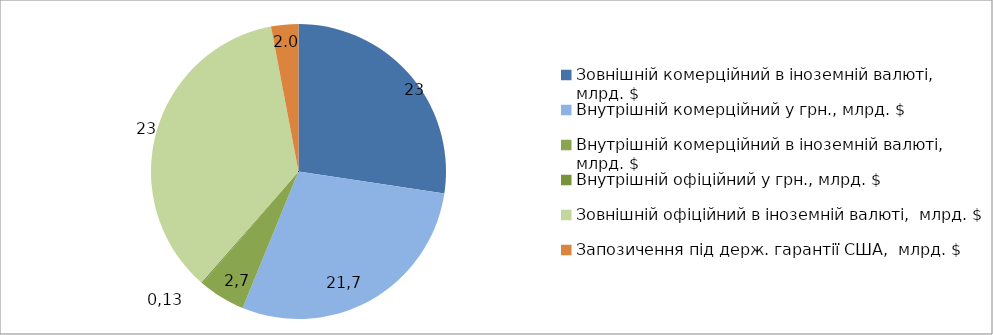
| Category | Series 0 |
|---|---|
| Зовнішній комерційний в іноземній валюті,  млрд. $ | 18.35 |
| Внутрішній комерційний у грн., млрд. $ | 19.29 |
| Внутрішній комерційний в іноземній валюті,  млрд. $ | 3.41 |
| Внутрішній офіційний у грн., млрд. $ | 0.1 |
| Зовнішній офіційний в іноземній валюті,  млрд. $ | 23.84 |
| Запозичення під держ. гарантії США,  млрд. $ | 2 |